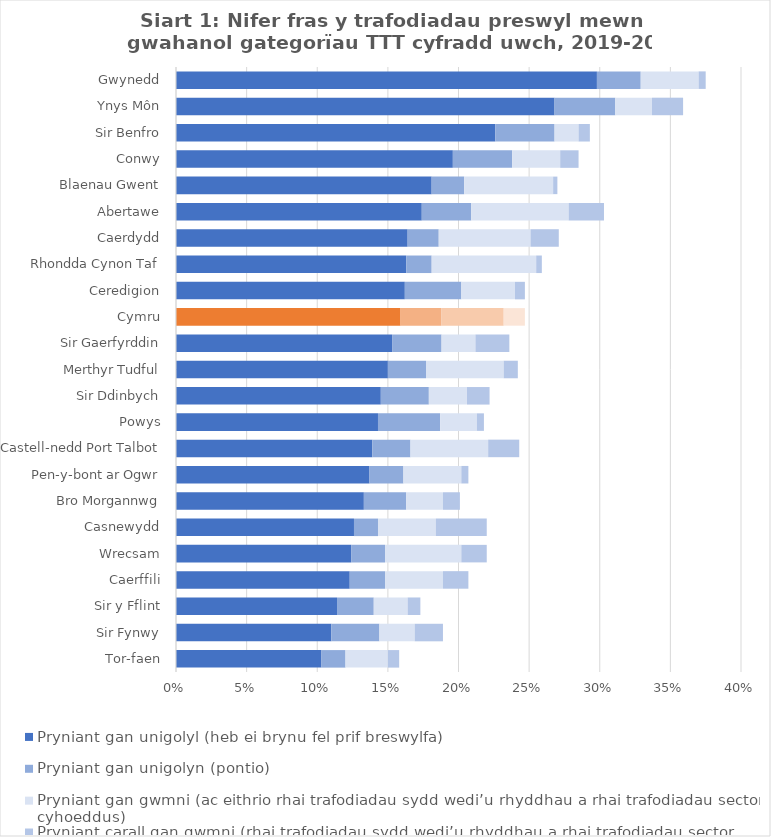
| Category | Pryniant gan unigolyl (heb ei brynu fel prif breswylfa) | Pryniant gan unigolyn (pontio) | Pryniant gan gwmni (ac eithrio rhai trafodiadau sydd wedi’u rhyddhau a rhai trafodiadau sector cyhoeddus) | Pryniant carall gan gwmni (rhai trafodiadau sydd wedi’u rhyddhau a rhai trafodiadau sector cyhoeddus) |
|---|---|---|---|---|
| Tor-faen | 0.103 | 0.017 | 0.03 | 0.008 |
| Sir Fynwy | 0.11 | 0.034 | 0.025 | 0.02 |
| Sir y Fflint | 0.114 | 0.026 | 0.024 | 0.009 |
| Caerffili | 0.123 | 0.025 | 0.041 | 0.018 |
| Wrecsam | 0.124 | 0.024 | 0.054 | 0.018 |
| Casnewydd | 0.126 | 0.017 | 0.041 | 0.036 |
| Bro Morgannwg | 0.133 | 0.03 | 0.026 | 0.012 |
| Pen-y-bont ar Ogwr | 0.137 | 0.024 | 0.041 | 0.005 |
| Castell-nedd Port Talbot | 0.139 | 0.027 | 0.055 | 0.022 |
| Powys | 0.143 | 0.044 | 0.026 | 0.005 |
| Sir Ddinbych | 0.145 | 0.034 | 0.027 | 0.016 |
| Merthyr Tudful | 0.15 | 0.027 | 0.055 | 0.01 |
| Sir Gaerfyrddin | 0.153 | 0.035 | 0.024 | 0.024 |
| Cymru | 0.159 | 0.029 | 0.044 | 0.015 |
| Ceredigion | 0.162 | 0.04 | 0.038 | 0.007 |
| Rhondda Cynon Taf | 0.163 | 0.018 | 0.074 | 0.004 |
| Caerdydd | 0.164 | 0.022 | 0.065 | 0.02 |
| Abertawe | 0.174 | 0.035 | 0.069 | 0.025 |
| Blaenau Gwent | 0.181 | 0.023 | 0.063 | 0.003 |
| Conwy | 0.196 | 0.042 | 0.034 | 0.013 |
| Sir Benfro | 0.226 | 0.042 | 0.017 | 0.008 |
| Ynys Môn | 0.268 | 0.043 | 0.026 | 0.022 |
| Gwynedd | 0.298 | 0.031 | 0.041 | 0.005 |